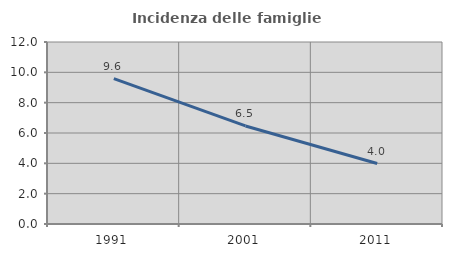
| Category | Incidenza delle famiglie numerose |
|---|---|
| 1991.0 | 9.586 |
| 2001.0 | 6.465 |
| 2011.0 | 3.986 |